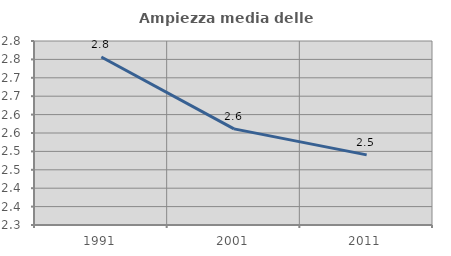
| Category | Ampiezza media delle famiglie |
|---|---|
| 1991.0 | 2.756 |
| 2001.0 | 2.561 |
| 2011.0 | 2.491 |